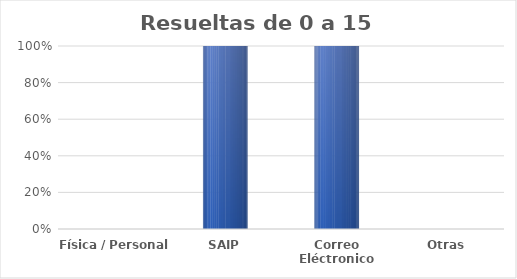
| Category | Series 0 |
|---|---|
| Física / Personal | 0 |
| SAIP | 2 |
| Correo Eléctronico | 2 |
| Otras | 0 |